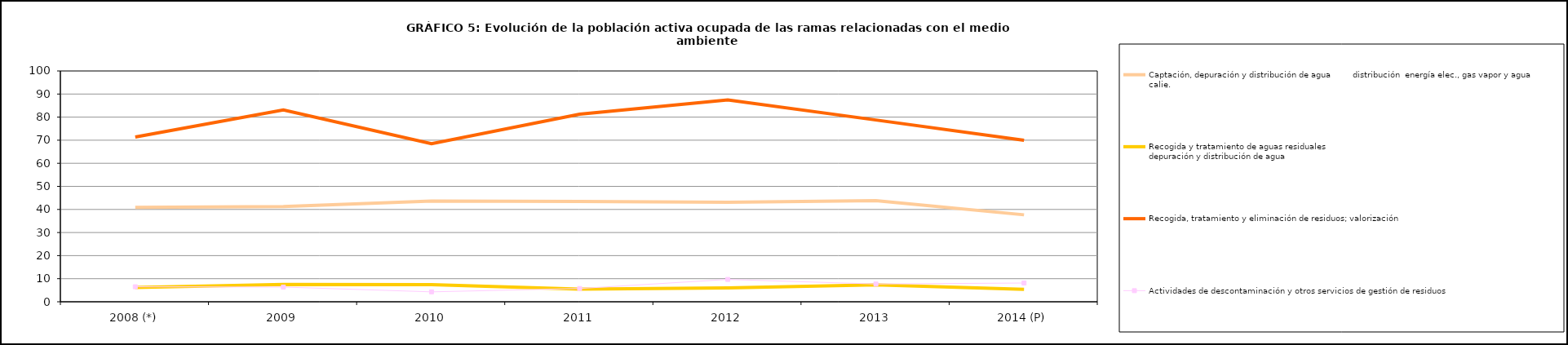
| Category | Captación, depuración y distribución de agua         distribución  energía elec., gas vapor y agua calie. | Recogida y tratamiento de aguas residuales                                                                                 depuración y distribución de agua | Recogida, tratamiento y eliminación de residuos; valorización       | Actividades de descontaminación y otros servicios de gestión de residuos  |
|---|---|---|---|---|
| 2008 (*) | 40.925 | 6.15 | 71.35 | 6.5 |
| 2009 | 41.25 | 7.525 | 83.125 | 6.375 |
| 2010 | 43.675 | 7.425 | 68.45 | 4.3 |
| 2011 | 43.425 | 5.5 | 81.275 | 5.75 |
| 2012 | 43.1 | 6.05 | 87.45 | 9.675 |
| 2013 | 43.8 | 7.3 | 78.75 | 7.7 |
| 2014 (P) | 37.675 | 5.35 | 70 | 8.125 |